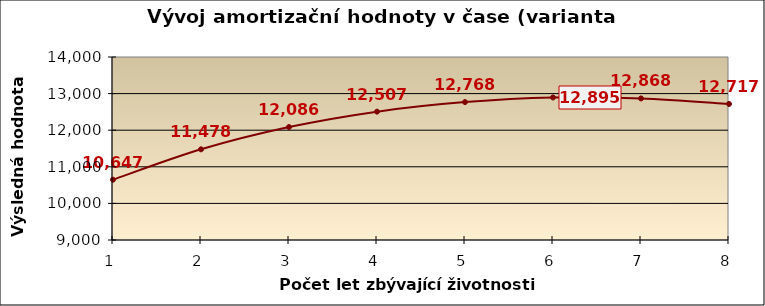
| Category | Series 0 |
|---|---|
| 1.0 | 10647.448 |
| 2.0 | 11477.532 |
| 3.0 | 12086.22 |
| 4.0 | 12506.929 |
| 5.0 | 12768.313 |
| 6.0 | 12894.927 |
| 7.0 | 12868.164 |
| 8.0 | 12716.941 |